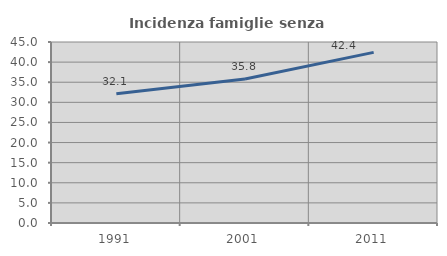
| Category | Incidenza famiglie senza nuclei |
|---|---|
| 1991.0 | 32.112 |
| 2001.0 | 35.818 |
| 2011.0 | 42.418 |